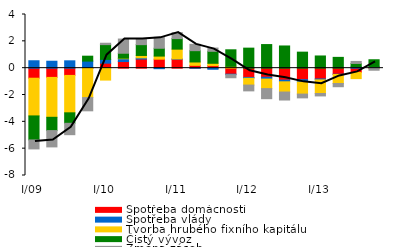
| Category | Spotřeba domácností | Spotřeba vlády | Tvorba hrubého fixního kapitálu | Čistý vývoz | Změna zásob |
|---|---|---|---|---|---|
| I/09 | -0.75 | 0.552 | -2.81 | -1.79 | -0.668 |
| II | -0.689 | 0.517 | -2.973 | -0.99 | -1.215 |
| III | -0.541 | 0.548 | -2.787 | -0.781 | -0.848 |
| IV | -0.026 | 0.526 | -2.167 | 0.367 | -0.986 |
| I/10 | 0.372 | 0.283 | -0.889 | 1.099 | 0.104 |
| II | 0.495 | 0.207 | 0.042 | 0.369 | 1.058 |
| III | 0.68 | 0.089 | 0.179 | 0.806 | 0.43 |
| IV | 0.67 | -0.039 | 0.23 | 0.583 | 0.815 |
| I/11 | 0.669 | 0.019 | 0.73 | 0.785 | 0.447 |
| II | 0.209 | -0.004 | 0.253 | 0.843 | 0.472 |
| III | 0.191 | -0.082 | 0.173 | 0.893 | 0.244 |
| IV | -0.449 | -0.036 | 0.135 | 1.234 | -0.229 |
| I/12 | -0.691 | -0.062 | -0.508 | 1.493 | -0.432 |
| II | -0.676 | -0.136 | -0.712 | 1.759 | -0.75 |
| III | -0.891 | -0.126 | -0.763 | 1.654 | -0.595 |
| IV | -0.859 | -0.177 | -0.897 | 1.194 | -0.282 |
| I/13 | -0.804 | -0.07 | -1.015 | 0.909 | -0.18 |
| II | -0.452 | -0.022 | -0.668 | 0.805 | -0.241 |
| III | -0.324 | 0.104 | -0.454 | 0.248 | 0.149 |
| IV | 0.054 | 0.052 | -0.008 | 0.521 | -0.145 |